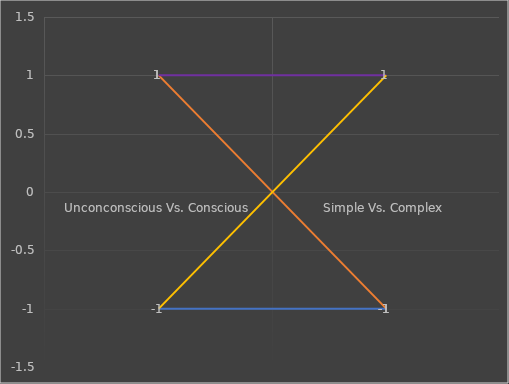
| Category | 1 | 2 | 3 | 4 |
|---|---|---|---|---|
| Unconconscious Vs. Conscious | -1 | 1 | 1 | -1 |
| Simple Vs. Complex | -1 | -1 | 1 | 1 |